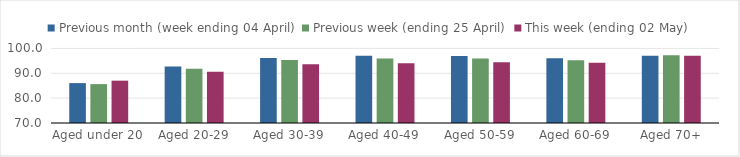
| Category | Previous month (week ending 04 April) | Previous week (ending 25 April) | This week (ending 02 May) |
|---|---|---|---|
| Aged under 20 | 86.05 | 85.642 | 87.031 |
| Aged 20-29 | 92.777 | 91.775 | 90.612 |
| Aged 30-39 | 96.195 | 95.323 | 93.655 |
| Aged 40-49 | 97.058 | 95.94 | 94.081 |
| Aged 50-59 | 96.994 | 95.983 | 94.427 |
| Aged 60-69 | 96.018 | 95.244 | 94.198 |
| Aged 70+ | 97.038 | 97.299 | 97.052 |